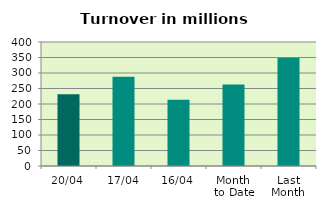
| Category | Series 0 |
|---|---|
| 20/04 | 231.646 |
| 17/04 | 287.801 |
| 16/04 | 213.772 |
| Month 
to Date | 262.683 |
| Last
Month | 348.012 |